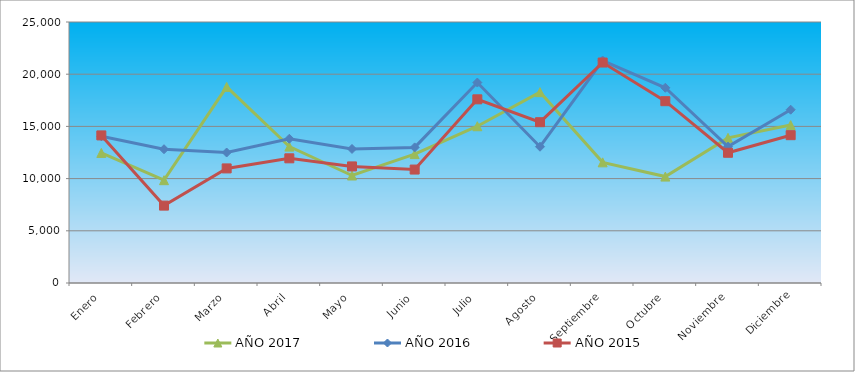
| Category | AÑO 2017 | AÑO 2016 | AÑO 2015 |
|---|---|---|---|
| Enero | 12458.735 | 14057.813 | 14136.698 |
| Febrero | 9849.1 | 12813.679 | 7411.749 |
| Marzo | 18785.433 | 12497.668 | 10975.99 |
| Abril | 13064.016 | 13815.819 | 11942.405 |
| Mayo | 10296.828 | 12840.15 | 11166.673 |
| Junio | 12343.431 | 12988.569 | 10865.948 |
| Julio | 15015.659 | 19199.568 | 17594.484 |
| Agosto | 18281.181 | 13051.877 | 15401.316 |
| Septiembre | 11557.121 | 21310.953 | 21117.035 |
| Octubre | 10193.454 | 18699.517 | 17413.627 |
| Noviembre | 13902.036 | 13063.604 | 12473.254 |
| Diciembre | 15125.287 | 16600.441 | 14158.293 |